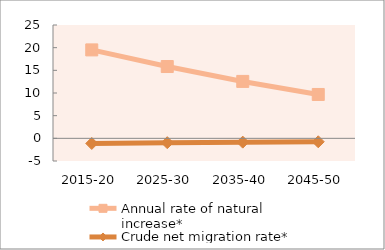
| Category | Annual rate of natural increase* | Crude net migration rate* |
|---|---|---|
| 2015-20 | 19.509 | -1.133 |
| 2025-30 | 15.84 | -0.959 |
| 2035-40 | 12.555 | -0.84 |
| 2045-50 | 9.673 | -0.758 |